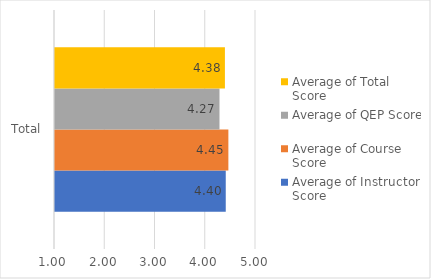
| Category | Average of Instructor Score | Average of Course Score | Average of QEP Score | Average of Total Score |
|---|---|---|---|---|
| Total | 4.398 | 4.45 | 4.273 | 4.381 |